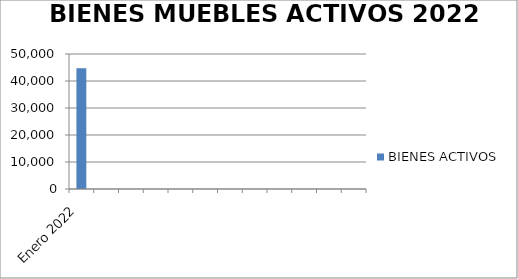
| Category | BIENES ACTIVOS |
|---|---|
| Enero 2022 | 44681 |